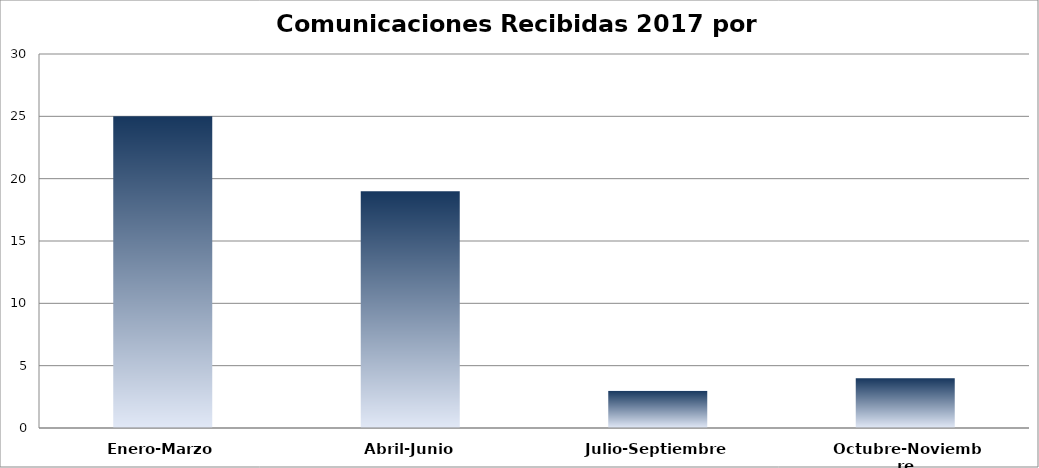
| Category | Series 0 |
|---|---|
| Enero-Marzo | 25 |
| Abril-Junio | 19 |
| Julio-Septiembre | 3 |
| Octubre-Noviembre | 4 |